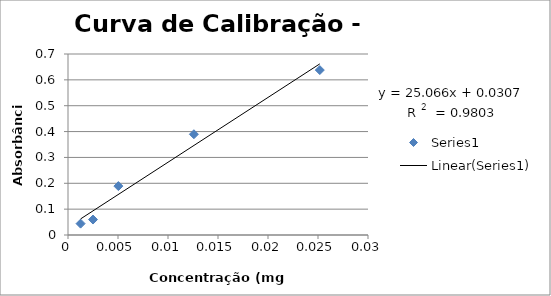
| Category | Series 0 |
|---|---|
| 0.001259 | 0.044 |
| 0.0025 | 0.06 |
| 0.005036 | 0.189 |
| 0.01259 | 0.39 |
| 0.02518 | 0.638 |